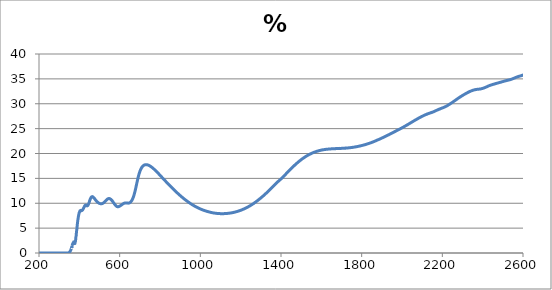
| Category | % Transmission |
|---|---|
| 200.0 | 0 |
| 201.0 | 0 |
| 202.0 | 0 |
| 203.0 | 0 |
| 204.0 | 0 |
| 205.0 | 0 |
| 206.0 | 0 |
| 207.0 | 0 |
| 208.0 | 0 |
| 209.0 | 0 |
| 210.0 | 0 |
| 211.0 | 0 |
| 212.0 | 0 |
| 213.0 | 0 |
| 214.0 | 0 |
| 215.0 | 0 |
| 216.0 | 0 |
| 217.0 | 0 |
| 218.0 | 0 |
| 219.0 | 0 |
| 220.0 | 0 |
| 221.0 | 0 |
| 222.0 | 0 |
| 223.0 | 0 |
| 224.0 | 0 |
| 225.0 | 0 |
| 226.0 | 0 |
| 227.0 | 0 |
| 228.0 | 0 |
| 229.0 | 0 |
| 230.0 | 0 |
| 231.0 | 0 |
| 232.0 | 0 |
| 233.0 | 0 |
| 234.0 | 0 |
| 235.0 | 0 |
| 236.0 | 0 |
| 237.0 | 0 |
| 238.0 | 0 |
| 239.0 | 0 |
| 240.0 | 0 |
| 241.0 | 0 |
| 242.0 | 0 |
| 243.0 | 0 |
| 244.0 | 0 |
| 245.0 | 0 |
| 246.0 | 0 |
| 247.0 | 0 |
| 248.0 | 0 |
| 249.0 | 0 |
| 250.0 | 0 |
| 251.0 | 0 |
| 252.0 | 0 |
| 253.0 | 0 |
| 254.0 | 0 |
| 255.0 | 0 |
| 256.0 | 0 |
| 257.0 | 0 |
| 258.0 | 0 |
| 259.0 | 0 |
| 260.0 | 0 |
| 261.0 | 0 |
| 262.0 | 0 |
| 263.0 | 0 |
| 264.0 | 0 |
| 265.0 | 0 |
| 266.0 | 0 |
| 267.0 | 0 |
| 268.0 | 0 |
| 269.0 | 0 |
| 270.0 | 0 |
| 271.0 | 0 |
| 272.0 | 0 |
| 273.0 | 0 |
| 274.0 | 0 |
| 275.0 | 0 |
| 276.0 | 0 |
| 277.0 | 0 |
| 278.0 | 0 |
| 279.0 | 0 |
| 280.0 | 0 |
| 281.0 | 0 |
| 282.0 | 0 |
| 283.0 | 0 |
| 284.0 | 0 |
| 285.0 | 0 |
| 286.0 | 0 |
| 287.0 | 0 |
| 288.0 | 0 |
| 289.0 | 0 |
| 290.0 | 0 |
| 291.0 | 0 |
| 292.0 | 0 |
| 293.0 | 0 |
| 294.0 | 0 |
| 295.0 | 0 |
| 296.0 | 0 |
| 297.0 | 0 |
| 298.0 | 0 |
| 299.0 | 0 |
| 300.0 | 0 |
| 301.0 | 0 |
| 302.0 | 0 |
| 303.0 | 0 |
| 304.0 | 0 |
| 305.0 | 0 |
| 306.0 | 0 |
| 307.0 | 0 |
| 308.0 | 0 |
| 309.0 | 0 |
| 310.0 | 0 |
| 311.0 | 0 |
| 312.0 | 0 |
| 313.0 | 0 |
| 314.0 | 0 |
| 315.0 | 0 |
| 316.0 | 0 |
| 317.0 | 0 |
| 318.0 | 0 |
| 319.0 | 0 |
| 320.0 | 0 |
| 321.0 | 0 |
| 322.0 | 0 |
| 323.0 | 0 |
| 324.0 | 0 |
| 325.0 | 0 |
| 326.0 | 0 |
| 327.0 | 0 |
| 328.0 | 0 |
| 329.0 | 0 |
| 330.0 | 0 |
| 331.0 | 0 |
| 332.0 | 0 |
| 333.0 | 0 |
| 334.0 | 0 |
| 335.0 | 0 |
| 336.0 | 0.001 |
| 337.0 | 0.001 |
| 338.0 | 0.002 |
| 339.0 | 0.003 |
| 340.0 | 0.004 |
| 341.0 | 0.007 |
| 342.0 | 0.01 |
| 343.0 | 0.015 |
| 344.0 | 0.021 |
| 345.0 | 0.03 |
| 346.0 | 0.041 |
| 347.0 | 0.056 |
| 348.0 | 0.075 |
| 349.0 | 0.099 |
| 350.0 | 0.129 |
| 351.0 | 0.164 |
| 352.0 | 0.207 |
| 353.0 | 0.256 |
| 354.0 | 0.312 |
| 355.0 | 0.378 |
| 356.0 | 0.453 |
| 357.0 | 0.54 |
| 358.0 | 0.637 |
| 359.0 | 0.744 |
| 360.0 | 0.863 |
| 361.0 | 0.99 |
| 362.0 | 1.124 |
| 363.0 | 1.021 |
| 364.0 | 1.442 |
| 365.0 | 1.608 |
| 366.0 | 1.713 |
| 367.0 | 1.829 |
| 368.0 | 1.947 |
| 369.0 | 1.919 |
| 370.0 | 2.068 |
| 371.0 | 2.061 |
| 372.0 | 2.236 |
| 373.0 | 2.046 |
| 374.0 | 1.979 |
| 375.0 | 1.981 |
| 376.0 | 1.899 |
| 377.0 | 1.944 |
| 378.0 | 1.903 |
| 379.0 | 2.208 |
| 380.0 | 2.252 |
| 381.0 | 2.43 |
| 382.0 | 2.763 |
| 383.0 | 3.207 |
| 384.0 | 3.401 |
| 385.0 | 3.907 |
| 386.0 | 4.207 |
| 387.0 | 4.649 |
| 388.0 | 4.839 |
| 389.0 | 5.319 |
| 390.0 | 5.76 |
| 391.0 | 6.071 |
| 392.0 | 6.46 |
| 393.0 | 6.685 |
| 394.0 | 6.941 |
| 395.0 | 7.236 |
| 396.0 | 7.479 |
| 397.0 | 7.658 |
| 398.0 | 7.869 |
| 399.0 | 8.055 |
| 400.0 | 8.169 |
| 401.0 | 8.231 |
| 402.0 | 8.36 |
| 403.0 | 8.473 |
| 404.0 | 8.446 |
| 405.0 | 8.493 |
| 406.0 | 8.51 |
| 407.0 | 8.511 |
| 408.0 | 8.575 |
| 409.0 | 8.514 |
| 410.0 | 8.493 |
| 411.0 | 8.527 |
| 412.0 | 8.532 |
| 413.0 | 8.56 |
| 414.0 | 8.563 |
| 415.0 | 8.607 |
| 416.0 | 8.663 |
| 417.0 | 8.695 |
| 418.0 | 8.795 |
| 419.0 | 8.862 |
| 420.0 | 8.94 |
| 421.0 | 8.974 |
| 422.0 | 9.122 |
| 423.0 | 9.168 |
| 424.0 | 9.24 |
| 425.0 | 9.355 |
| 426.0 | 9.423 |
| 427.0 | 9.462 |
| 428.0 | 9.547 |
| 429.0 | 9.563 |
| 430.0 | 9.605 |
| 431.0 | 9.616 |
| 432.0 | 9.65 |
| 433.0 | 9.632 |
| 434.0 | 9.618 |
| 435.0 | 9.608 |
| 436.0 | 9.558 |
| 437.0 | 9.524 |
| 438.0 | 9.467 |
| 439.0 | 9.492 |
| 440.0 | 9.493 |
| 441.0 | 9.536 |
| 442.0 | 9.536 |
| 443.0 | 9.631 |
| 444.0 | 9.683 |
| 445.0 | 9.778 |
| 446.0 | 9.872 |
| 447.0 | 10.003 |
| 448.0 | 10.08 |
| 449.0 | 10.215 |
| 450.0 | 10.337 |
| 451.0 | 10.48 |
| 452.0 | 10.598 |
| 453.0 | 10.693 |
| 454.0 | 10.813 |
| 455.0 | 10.903 |
| 456.0 | 10.998 |
| 457.0 | 11.06 |
| 458.0 | 11.164 |
| 459.0 | 11.196 |
| 460.0 | 11.253 |
| 461.0 | 11.287 |
| 462.0 | 11.317 |
| 463.0 | 11.327 |
| 464.0 | 11.333 |
| 465.0 | 11.322 |
| 466.0 | 11.311 |
| 467.0 | 11.286 |
| 468.0 | 11.247 |
| 469.0 | 11.219 |
| 470.0 | 11.174 |
| 471.0 | 11.146 |
| 472.0 | 11.09 |
| 473.0 | 11.043 |
| 474.0 | 10.996 |
| 475.0 | 10.955 |
| 476.0 | 10.91 |
| 477.0 | 10.848 |
| 478.0 | 10.794 |
| 479.0 | 10.74 |
| 480.0 | 10.683 |
| 481.0 | 10.625 |
| 482.0 | 10.575 |
| 483.0 | 10.537 |
| 484.0 | 10.473 |
| 485.0 | 10.443 |
| 486.0 | 10.383 |
| 487.0 | 10.35 |
| 488.0 | 10.301 |
| 489.0 | 10.262 |
| 490.0 | 10.24 |
| 491.0 | 10.189 |
| 492.0 | 10.177 |
| 493.0 | 10.137 |
| 494.0 | 10.117 |
| 495.0 | 10.075 |
| 496.0 | 10.049 |
| 497.0 | 10.027 |
| 498.0 | 10.011 |
| 499.0 | 9.984 |
| 500.0 | 9.97 |
| 501.0 | 9.955 |
| 502.0 | 9.939 |
| 503.0 | 9.928 |
| 504.0 | 9.915 |
| 505.0 | 9.906 |
| 506.0 | 9.882 |
| 507.0 | 9.887 |
| 508.0 | 9.895 |
| 509.0 | 9.878 |
| 510.0 | 9.891 |
| 511.0 | 9.909 |
| 512.0 | 9.917 |
| 513.0 | 9.93 |
| 514.0 | 9.941 |
| 515.0 | 9.965 |
| 516.0 | 9.975 |
| 517.0 | 10.011 |
| 518.0 | 10.033 |
| 519.0 | 10.052 |
| 520.0 | 10.082 |
| 521.0 | 10.102 |
| 522.0 | 10.132 |
| 523.0 | 10.175 |
| 524.0 | 10.21 |
| 525.0 | 10.248 |
| 526.0 | 10.285 |
| 527.0 | 10.322 |
| 528.0 | 10.376 |
| 529.0 | 10.419 |
| 530.0 | 10.461 |
| 531.0 | 10.503 |
| 532.0 | 10.555 |
| 533.0 | 10.595 |
| 534.0 | 10.638 |
| 535.0 | 10.673 |
| 536.0 | 10.708 |
| 537.0 | 10.747 |
| 538.0 | 10.79 |
| 539.0 | 10.834 |
| 540.0 | 10.847 |
| 541.0 | 10.877 |
| 542.0 | 10.887 |
| 543.0 | 10.907 |
| 544.0 | 10.92 |
| 545.0 | 10.941 |
| 546.0 | 10.942 |
| 547.0 | 10.942 |
| 548.0 | 10.947 |
| 549.0 | 10.934 |
| 550.0 | 10.93 |
| 551.0 | 10.921 |
| 552.0 | 10.886 |
| 553.0 | 10.873 |
| 554.0 | 10.836 |
| 555.0 | 10.809 |
| 556.0 | 10.783 |
| 557.0 | 10.752 |
| 558.0 | 10.694 |
| 559.0 | 10.659 |
| 560.0 | 10.62 |
| 561.0 | 10.578 |
| 562.0 | 10.524 |
| 563.0 | 10.491 |
| 564.0 | 10.426 |
| 565.0 | 10.362 |
| 566.0 | 10.331 |
| 567.0 | 10.262 |
| 568.0 | 10.196 |
| 569.0 | 10.132 |
| 570.0 | 10.097 |
| 571.0 | 10.038 |
| 572.0 | 9.977 |
| 573.0 | 9.924 |
| 574.0 | 9.872 |
| 575.0 | 9.816 |
| 576.0 | 9.759 |
| 577.0 | 9.709 |
| 578.0 | 9.658 |
| 579.0 | 9.618 |
| 580.0 | 9.568 |
| 581.0 | 9.528 |
| 582.0 | 9.493 |
| 583.0 | 9.45 |
| 584.0 | 9.412 |
| 585.0 | 9.392 |
| 586.0 | 9.36 |
| 587.0 | 9.336 |
| 588.0 | 9.326 |
| 589.0 | 9.305 |
| 590.0 | 9.297 |
| 591.0 | 9.296 |
| 592.0 | 9.299 |
| 593.0 | 9.307 |
| 594.0 | 9.312 |
| 595.0 | 9.324 |
| 596.0 | 9.344 |
| 597.0 | 9.355 |
| 598.0 | 9.38 |
| 599.0 | 9.403 |
| 600.0 | 9.416 |
| 601.0 | 9.445 |
| 602.0 | 9.473 |
| 603.0 | 9.492 |
| 604.0 | 9.523 |
| 605.0 | 9.55 |
| 606.0 | 9.573 |
| 607.0 | 9.603 |
| 608.0 | 9.631 |
| 609.0 | 9.661 |
| 610.0 | 9.689 |
| 611.0 | 9.721 |
| 612.0 | 9.751 |
| 613.0 | 9.78 |
| 614.0 | 9.806 |
| 615.0 | 9.839 |
| 616.0 | 9.865 |
| 617.0 | 9.889 |
| 618.0 | 9.918 |
| 619.0 | 9.943 |
| 620.0 | 9.961 |
| 621.0 | 9.98 |
| 622.0 | 10.004 |
| 623.0 | 10.016 |
| 624.0 | 10.029 |
| 625.0 | 10.042 |
| 626.0 | 10.05 |
| 627.0 | 10.057 |
| 628.0 | 10.063 |
| 629.0 | 10.064 |
| 630.0 | 10.06 |
| 631.0 | 10.066 |
| 632.0 | 10.057 |
| 633.0 | 10.055 |
| 634.0 | 10.051 |
| 635.0 | 10.04 |
| 636.0 | 10.043 |
| 637.0 | 10.042 |
| 638.0 | 10.032 |
| 639.0 | 10.025 |
| 640.0 | 10.027 |
| 641.0 | 10.021 |
| 642.0 | 10.024 |
| 643.0 | 10.021 |
| 644.0 | 10.028 |
| 645.0 | 10.034 |
| 646.0 | 10.037 |
| 647.0 | 10.053 |
| 648.0 | 10.064 |
| 649.0 | 10.087 |
| 650.0 | 10.113 |
| 651.0 | 10.136 |
| 652.0 | 10.167 |
| 653.0 | 10.197 |
| 654.0 | 10.231 |
| 655.0 | 10.276 |
| 656.0 | 10.318 |
| 657.0 | 10.37 |
| 658.0 | 10.423 |
| 659.0 | 10.484 |
| 660.0 | 10.55 |
| 661.0 | 10.618 |
| 662.0 | 10.692 |
| 663.0 | 10.775 |
| 664.0 | 10.859 |
| 665.0 | 10.951 |
| 666.0 | 11.05 |
| 667.0 | 11.155 |
| 668.0 | 11.265 |
| 669.0 | 11.379 |
| 670.0 | 11.505 |
| 671.0 | 11.639 |
| 672.0 | 11.771 |
| 673.0 | 11.915 |
| 674.0 | 12.069 |
| 675.0 | 12.23 |
| 676.0 | 12.388 |
| 677.0 | 12.554 |
| 678.0 | 12.731 |
| 679.0 | 12.911 |
| 680.0 | 13.083 |
| 681.0 | 13.272 |
| 682.0 | 13.456 |
| 683.0 | 13.645 |
| 684.0 | 13.836 |
| 685.0 | 14.02 |
| 686.0 | 14.208 |
| 687.0 | 14.387 |
| 688.0 | 14.568 |
| 689.0 | 14.749 |
| 690.0 | 14.923 |
| 691.0 | 15.089 |
| 692.0 | 15.259 |
| 693.0 | 15.415 |
| 694.0 | 15.569 |
| 695.0 | 15.715 |
| 696.0 | 15.859 |
| 697.0 | 15.995 |
| 698.0 | 16.119 |
| 699.0 | 16.246 |
| 700.0 | 16.367 |
| 701.0 | 16.472 |
| 702.0 | 16.578 |
| 703.0 | 16.676 |
| 704.0 | 16.768 |
| 705.0 | 16.862 |
| 706.0 | 16.941 |
| 707.0 | 17.02 |
| 708.0 | 17.088 |
| 709.0 | 17.156 |
| 710.0 | 17.212 |
| 711.0 | 17.281 |
| 712.0 | 17.33 |
| 713.0 | 17.383 |
| 714.0 | 17.435 |
| 715.0 | 17.463 |
| 716.0 | 17.515 |
| 717.0 | 17.547 |
| 718.0 | 17.581 |
| 719.0 | 17.6 |
| 720.0 | 17.631 |
| 721.0 | 17.663 |
| 722.0 | 17.677 |
| 723.0 | 17.694 |
| 724.0 | 17.708 |
| 725.0 | 17.717 |
| 726.0 | 17.732 |
| 727.0 | 17.738 |
| 728.0 | 17.748 |
| 729.0 | 17.75 |
| 730.0 | 17.749 |
| 731.0 | 17.753 |
| 732.0 | 17.754 |
| 733.0 | 17.743 |
| 734.0 | 17.743 |
| 735.0 | 17.737 |
| 736.0 | 17.73 |
| 737.0 | 17.725 |
| 738.0 | 17.721 |
| 739.0 | 17.706 |
| 740.0 | 17.691 |
| 741.0 | 17.676 |
| 742.0 | 17.658 |
| 743.0 | 17.643 |
| 744.0 | 17.622 |
| 745.0 | 17.601 |
| 746.0 | 17.583 |
| 747.0 | 17.562 |
| 748.0 | 17.545 |
| 749.0 | 17.513 |
| 750.0 | 17.489 |
| 751.0 | 17.469 |
| 752.0 | 17.44 |
| 753.0 | 17.421 |
| 754.0 | 17.393 |
| 755.0 | 17.364 |
| 756.0 | 17.332 |
| 757.0 | 17.301 |
| 758.0 | 17.278 |
| 759.0 | 17.239 |
| 760.0 | 17.217 |
| 761.0 | 17.179 |
| 762.0 | 17.15 |
| 763.0 | 17.113 |
| 764.0 | 17.08 |
| 765.0 | 17.05 |
| 766.0 | 17.011 |
| 767.0 | 16.976 |
| 768.0 | 16.933 |
| 769.0 | 16.905 |
| 770.0 | 16.869 |
| 771.0 | 16.828 |
| 772.0 | 16.795 |
| 773.0 | 16.755 |
| 774.0 | 16.714 |
| 775.0 | 16.677 |
| 776.0 | 16.64 |
| 777.0 | 16.604 |
| 778.0 | 16.563 |
| 779.0 | 16.524 |
| 780.0 | 16.474 |
| 781.0 | 16.444 |
| 782.0 | 16.395 |
| 783.0 | 16.361 |
| 784.0 | 16.321 |
| 785.0 | 16.278 |
| 786.0 | 16.232 |
| 787.0 | 16.191 |
| 788.0 | 16.152 |
| 789.0 | 16.11 |
| 790.0 | 16.072 |
| 791.0 | 16.026 |
| 792.0 | 15.987 |
| 793.0 | 15.942 |
| 794.0 | 15.904 |
| 795.0 | 15.853 |
| 796.0 | 15.812 |
| 797.0 | 15.762 |
| 798.0 | 15.72 |
| 799.0 | 15.681 |
| 800.0 | 15.641 |
| 801.0 | 15.59 |
| 802.0 | 15.552 |
| 803.0 | 15.509 |
| 804.0 | 15.467 |
| 805.0 | 15.421 |
| 806.0 | 15.378 |
| 807.0 | 15.333 |
| 808.0 | 15.29 |
| 809.0 | 15.246 |
| 810.0 | 15.198 |
| 811.0 | 15.156 |
| 812.0 | 15.112 |
| 813.0 | 15.072 |
| 814.0 | 15.027 |
| 815.0 | 14.979 |
| 816.0 | 14.938 |
| 817.0 | 14.897 |
| 818.0 | 14.852 |
| 819.0 | 14.813 |
| 820.0 | 14.765 |
| 821.0 | 14.713 |
| 822.0 | 14.675 |
| 823.0 | 14.638 |
| 824.0 | 14.59 |
| 825.0 | 14.55 |
| 826.0 | 14.505 |
| 827.0 | 14.467 |
| 828.0 | 14.419 |
| 829.0 | 14.376 |
| 830.0 | 14.333 |
| 831.0 | 14.295 |
| 832.0 | 14.241 |
| 833.0 | 14.202 |
| 834.0 | 14.158 |
| 835.0 | 14.118 |
| 836.0 | 14.077 |
| 837.0 | 14.031 |
| 838.0 | 13.992 |
| 839.0 | 13.945 |
| 840.0 | 13.908 |
| 841.0 | 13.869 |
| 842.0 | 13.828 |
| 843.0 | 13.78 |
| 844.0 | 13.737 |
| 845.0 | 13.695 |
| 846.0 | 13.654 |
| 847.0 | 13.612 |
| 848.0 | 13.574 |
| 849.0 | 13.533 |
| 850.0 | 13.488 |
| 851.0 | 13.449 |
| 852.0 | 13.409 |
| 853.0 | 13.366 |
| 854.0 | 13.322 |
| 855.0 | 13.283 |
| 856.0 | 13.239 |
| 857.0 | 13.198 |
| 858.0 | 13.158 |
| 859.0 | 13.12 |
| 860.0 | 13.079 |
| 861.0 | 13.036 |
| 862.0 | 12.997 |
| 863.0 | 12.954 |
| 864.0 | 12.915 |
| 865.0 | 12.876 |
| 866.0 | 12.835 |
| 867.0 | 12.794 |
| 868.0 | 12.758 |
| 869.0 | 12.716 |
| 870.0 | 12.68 |
| 871.0 | 12.639 |
| 872.0 | 12.599 |
| 873.0 | 12.56 |
| 874.0 | 12.521 |
| 875.0 | 12.483 |
| 876.0 | 12.442 |
| 877.0 | 12.405 |
| 878.0 | 12.366 |
| 879.0 | 12.328 |
| 880.0 | 12.287 |
| 881.0 | 12.252 |
| 882.0 | 12.213 |
| 883.0 | 12.175 |
| 884.0 | 12.138 |
| 885.0 | 12.102 |
| 886.0 | 12.063 |
| 887.0 | 12.024 |
| 888.0 | 11.988 |
| 889.0 | 11.948 |
| 890.0 | 11.912 |
| 891.0 | 11.876 |
| 892.0 | 11.84 |
| 893.0 | 11.803 |
| 894.0 | 11.765 |
| 895.0 | 11.728 |
| 896.0 | 11.694 |
| 897.0 | 11.657 |
| 898.0 | 11.621 |
| 899.0 | 11.585 |
| 900.0 | 11.55 |
| 901.0 | 11.513 |
| 902.0 | 11.478 |
| 903.0 | 11.444 |
| 904.0 | 11.409 |
| 905.0 | 11.375 |
| 906.0 | 11.34 |
| 907.0 | 11.306 |
| 908.0 | 11.269 |
| 909.0 | 11.234 |
| 910.0 | 11.2 |
| 911.0 | 11.168 |
| 912.0 | 11.134 |
| 913.0 | 11.1 |
| 914.0 | 11.067 |
| 915.0 | 11.032 |
| 916.0 | 10.999 |
| 917.0 | 10.966 |
| 918.0 | 10.934 |
| 919.0 | 10.902 |
| 920.0 | 10.866 |
| 921.0 | 10.836 |
| 922.0 | 10.803 |
| 923.0 | 10.772 |
| 924.0 | 10.739 |
| 925.0 | 10.71 |
| 926.0 | 10.678 |
| 927.0 | 10.645 |
| 928.0 | 10.614 |
| 929.0 | 10.584 |
| 930.0 | 10.555 |
| 931.0 | 10.523 |
| 932.0 | 10.493 |
| 933.0 | 10.463 |
| 934.0 | 10.432 |
| 935.0 | 10.403 |
| 936.0 | 10.372 |
| 937.0 | 10.344 |
| 938.0 | 10.314 |
| 939.0 | 10.286 |
| 940.0 | 10.257 |
| 941.0 | 10.228 |
| 942.0 | 10.2 |
| 943.0 | 10.171 |
| 944.0 | 10.142 |
| 945.0 | 10.113 |
| 946.0 | 10.085 |
| 947.0 | 10.057 |
| 948.0 | 10.03 |
| 949.0 | 10.002 |
| 950.0 | 9.976 |
| 951.0 | 9.948 |
| 952.0 | 9.919 |
| 953.0 | 9.893 |
| 954.0 | 9.868 |
| 955.0 | 9.84 |
| 956.0 | 9.813 |
| 957.0 | 9.789 |
| 958.0 | 9.763 |
| 959.0 | 9.737 |
| 960.0 | 9.712 |
| 961.0 | 9.687 |
| 962.0 | 9.661 |
| 963.0 | 9.637 |
| 964.0 | 9.613 |
| 965.0 | 9.588 |
| 966.0 | 9.564 |
| 967.0 | 9.541 |
| 968.0 | 9.517 |
| 969.0 | 9.493 |
| 970.0 | 9.47 |
| 971.0 | 9.447 |
| 972.0 | 9.424 |
| 973.0 | 9.402 |
| 974.0 | 9.378 |
| 975.0 | 9.357 |
| 976.0 | 9.335 |
| 977.0 | 9.312 |
| 978.0 | 9.29 |
| 979.0 | 9.269 |
| 980.0 | 9.248 |
| 981.0 | 9.226 |
| 982.0 | 9.205 |
| 983.0 | 9.184 |
| 984.0 | 9.163 |
| 985.0 | 9.143 |
| 986.0 | 9.122 |
| 987.0 | 9.103 |
| 988.0 | 9.082 |
| 989.0 | 9.062 |
| 990.0 | 9.043 |
| 991.0 | 9.023 |
| 992.0 | 9.004 |
| 993.0 | 8.985 |
| 994.0 | 8.966 |
| 995.0 | 8.947 |
| 996.0 | 8.929 |
| 997.0 | 8.911 |
| 998.0 | 8.893 |
| 999.0 | 8.875 |
| 1000.0 | 8.857 |
| 1001.0 | 8.841 |
| 1002.0 | 8.821 |
| 1003.0 | 8.805 |
| 1004.0 | 8.788 |
| 1005.0 | 8.771 |
| 1006.0 | 8.753 |
| 1007.0 | 8.738 |
| 1008.0 | 8.721 |
| 1009.0 | 8.705 |
| 1010.0 | 8.689 |
| 1011.0 | 8.675 |
| 1012.0 | 8.657 |
| 1013.0 | 8.641 |
| 1014.0 | 8.628 |
| 1015.0 | 8.613 |
| 1016.0 | 8.597 |
| 1017.0 | 8.583 |
| 1018.0 | 8.568 |
| 1019.0 | 8.553 |
| 1020.0 | 8.54 |
| 1021.0 | 8.525 |
| 1022.0 | 8.51 |
| 1023.0 | 8.498 |
| 1024.0 | 8.483 |
| 1025.0 | 8.47 |
| 1026.0 | 8.457 |
| 1027.0 | 8.444 |
| 1028.0 | 8.431 |
| 1029.0 | 8.418 |
| 1030.0 | 8.407 |
| 1031.0 | 8.393 |
| 1032.0 | 8.382 |
| 1033.0 | 8.37 |
| 1034.0 | 8.357 |
| 1035.0 | 8.346 |
| 1036.0 | 8.334 |
| 1037.0 | 8.323 |
| 1038.0 | 8.312 |
| 1039.0 | 8.302 |
| 1040.0 | 8.29 |
| 1041.0 | 8.279 |
| 1042.0 | 8.269 |
| 1043.0 | 8.258 |
| 1044.0 | 8.249 |
| 1045.0 | 8.238 |
| 1046.0 | 8.228 |
| 1047.0 | 8.218 |
| 1048.0 | 8.21 |
| 1049.0 | 8.199 |
| 1050.0 | 8.176 |
| 1051.0 | 8.164 |
| 1052.0 | 8.156 |
| 1053.0 | 8.147 |
| 1054.0 | 8.137 |
| 1055.0 | 8.13 |
| 1056.0 | 8.12 |
| 1057.0 | 8.115 |
| 1058.0 | 8.108 |
| 1059.0 | 8.099 |
| 1060.0 | 8.09 |
| 1061.0 | 8.084 |
| 1062.0 | 8.076 |
| 1063.0 | 8.068 |
| 1064.0 | 8.063 |
| 1065.0 | 8.056 |
| 1066.0 | 8.049 |
| 1067.0 | 8.039 |
| 1068.0 | 8.036 |
| 1069.0 | 8.029 |
| 1070.0 | 8.022 |
| 1071.0 | 8.017 |
| 1072.0 | 8.012 |
| 1073.0 | 8.007 |
| 1074.0 | 7.998 |
| 1075.0 | 7.994 |
| 1076.0 | 7.992 |
| 1077.0 | 7.982 |
| 1078.0 | 7.98 |
| 1079.0 | 7.975 |
| 1080.0 | 7.971 |
| 1081.0 | 7.965 |
| 1082.0 | 7.96 |
| 1083.0 | 7.957 |
| 1084.0 | 7.953 |
| 1085.0 | 7.948 |
| 1086.0 | 7.946 |
| 1087.0 | 7.943 |
| 1088.0 | 7.939 |
| 1089.0 | 7.936 |
| 1090.0 | 7.934 |
| 1091.0 | 7.93 |
| 1092.0 | 7.926 |
| 1093.0 | 7.927 |
| 1094.0 | 7.925 |
| 1095.0 | 7.919 |
| 1096.0 | 7.918 |
| 1097.0 | 7.918 |
| 1098.0 | 7.913 |
| 1099.0 | 7.912 |
| 1100.0 | 7.912 |
| 1101.0 | 7.912 |
| 1102.0 | 7.912 |
| 1103.0 | 7.908 |
| 1104.0 | 7.907 |
| 1105.0 | 7.906 |
| 1106.0 | 7.906 |
| 1107.0 | 7.907 |
| 1108.0 | 7.906 |
| 1109.0 | 7.907 |
| 1110.0 | 7.905 |
| 1111.0 | 7.905 |
| 1112.0 | 7.906 |
| 1113.0 | 7.906 |
| 1114.0 | 7.909 |
| 1115.0 | 7.911 |
| 1116.0 | 7.911 |
| 1117.0 | 7.909 |
| 1118.0 | 7.913 |
| 1119.0 | 7.919 |
| 1120.0 | 7.914 |
| 1121.0 | 7.919 |
| 1122.0 | 7.921 |
| 1123.0 | 7.921 |
| 1124.0 | 7.923 |
| 1125.0 | 7.926 |
| 1126.0 | 7.928 |
| 1127.0 | 7.932 |
| 1128.0 | 7.936 |
| 1129.0 | 7.939 |
| 1130.0 | 7.941 |
| 1131.0 | 7.942 |
| 1132.0 | 7.949 |
| 1133.0 | 7.951 |
| 1134.0 | 7.956 |
| 1135.0 | 7.96 |
| 1136.0 | 7.966 |
| 1137.0 | 7.975 |
| 1138.0 | 7.966 |
| 1139.0 | 7.981 |
| 1140.0 | 7.982 |
| 1141.0 | 7.988 |
| 1142.0 | 7.997 |
| 1143.0 | 7.997 |
| 1144.0 | 8.004 |
| 1145.0 | 8.01 |
| 1146.0 | 8.018 |
| 1147.0 | 8.021 |
| 1148.0 | 8.028 |
| 1149.0 | 8.037 |
| 1150.0 | 8.036 |
| 1151.0 | 8.048 |
| 1152.0 | 8.054 |
| 1153.0 | 8.061 |
| 1154.0 | 8.067 |
| 1155.0 | 8.079 |
| 1156.0 | 8.083 |
| 1157.0 | 8.093 |
| 1158.0 | 8.095 |
| 1159.0 | 8.106 |
| 1160.0 | 8.116 |
| 1161.0 | 8.122 |
| 1162.0 | 8.131 |
| 1163.0 | 8.142 |
| 1164.0 | 8.146 |
| 1165.0 | 8.156 |
| 1166.0 | 8.169 |
| 1167.0 | 8.175 |
| 1168.0 | 8.193 |
| 1169.0 | 8.19 |
| 1170.0 | 8.205 |
| 1171.0 | 8.215 |
| 1172.0 | 8.226 |
| 1173.0 | 8.238 |
| 1174.0 | 8.245 |
| 1175.0 | 8.259 |
| 1176.0 | 8.27 |
| 1177.0 | 8.279 |
| 1178.0 | 8.29 |
| 1179.0 | 8.304 |
| 1180.0 | 8.314 |
| 1181.0 | 8.327 |
| 1182.0 | 8.334 |
| 1183.0 | 8.349 |
| 1184.0 | 8.363 |
| 1185.0 | 8.375 |
| 1186.0 | 8.391 |
| 1187.0 | 8.398 |
| 1188.0 | 8.416 |
| 1189.0 | 8.428 |
| 1190.0 | 8.44 |
| 1191.0 | 8.453 |
| 1192.0 | 8.467 |
| 1193.0 | 8.482 |
| 1194.0 | 8.493 |
| 1195.0 | 8.51 |
| 1196.0 | 8.522 |
| 1197.0 | 8.539 |
| 1198.0 | 8.555 |
| 1199.0 | 8.569 |
| 1200.0 | 8.586 |
| 1201.0 | 8.601 |
| 1202.0 | 8.612 |
| 1203.0 | 8.629 |
| 1204.0 | 8.646 |
| 1205.0 | 8.662 |
| 1206.0 | 8.678 |
| 1207.0 | 8.694 |
| 1208.0 | 8.711 |
| 1209.0 | 8.727 |
| 1210.0 | 8.745 |
| 1211.0 | 8.774 |
| 1212.0 | 8.78 |
| 1213.0 | 8.797 |
| 1214.0 | 8.813 |
| 1215.0 | 8.835 |
| 1216.0 | 8.852 |
| 1217.0 | 8.867 |
| 1218.0 | 8.888 |
| 1219.0 | 8.908 |
| 1220.0 | 8.926 |
| 1221.0 | 8.939 |
| 1222.0 | 8.967 |
| 1223.0 | 8.985 |
| 1224.0 | 9.002 |
| 1225.0 | 9.02 |
| 1226.0 | 9.043 |
| 1227.0 | 9.068 |
| 1228.0 | 9.087 |
| 1229.0 | 9.104 |
| 1230.0 | 9.12 |
| 1231.0 | 9.149 |
| 1232.0 | 9.169 |
| 1233.0 | 9.191 |
| 1234.0 | 9.207 |
| 1235.0 | 9.23 |
| 1236.0 | 9.261 |
| 1237.0 | 9.278 |
| 1238.0 | 9.298 |
| 1239.0 | 9.32 |
| 1240.0 | 9.347 |
| 1241.0 | 9.368 |
| 1242.0 | 9.391 |
| 1243.0 | 9.417 |
| 1244.0 | 9.44 |
| 1245.0 | 9.464 |
| 1246.0 | 9.487 |
| 1247.0 | 9.511 |
| 1248.0 | 9.537 |
| 1249.0 | 9.562 |
| 1250.0 | 9.587 |
| 1251.0 | 9.589 |
| 1252.0 | 9.634 |
| 1253.0 | 9.659 |
| 1254.0 | 9.688 |
| 1255.0 | 9.713 |
| 1256.0 | 9.736 |
| 1257.0 | 9.764 |
| 1258.0 | 9.798 |
| 1259.0 | 9.82 |
| 1260.0 | 9.843 |
| 1261.0 | 9.875 |
| 1262.0 | 9.902 |
| 1263.0 | 9.927 |
| 1264.0 | 9.953 |
| 1265.0 | 9.983 |
| 1266.0 | 9.985 |
| 1267.0 | 10.038 |
| 1268.0 | 10.065 |
| 1269.0 | 10.096 |
| 1270.0 | 10.124 |
| 1271.0 | 10.151 |
| 1272.0 | 10.181 |
| 1273.0 | 10.21 |
| 1274.0 | 10.238 |
| 1275.0 | 10.268 |
| 1276.0 | 10.299 |
| 1277.0 | 10.328 |
| 1278.0 | 10.357 |
| 1279.0 | 10.389 |
| 1280.0 | 10.419 |
| 1281.0 | 10.451 |
| 1282.0 | 10.481 |
| 1283.0 | 10.514 |
| 1284.0 | 10.543 |
| 1285.0 | 10.571 |
| 1286.0 | 10.607 |
| 1287.0 | 10.64 |
| 1288.0 | 10.671 |
| 1289.0 | 10.702 |
| 1290.0 | 10.734 |
| 1291.0 | 10.767 |
| 1292.0 | 10.799 |
| 1293.0 | 10.831 |
| 1294.0 | 10.866 |
| 1295.0 | 10.898 |
| 1296.0 | 10.928 |
| 1297.0 | 10.967 |
| 1298.0 | 10.996 |
| 1299.0 | 11.031 |
| 1300.0 | 11.065 |
| 1301.0 | 11.099 |
| 1302.0 | 11.134 |
| 1303.0 | 11.167 |
| 1304.0 | 11.203 |
| 1305.0 | 11.235 |
| 1306.0 | 11.275 |
| 1307.0 | 11.302 |
| 1308.0 | 11.342 |
| 1309.0 | 11.376 |
| 1310.0 | 11.413 |
| 1311.0 | 11.453 |
| 1312.0 | 11.485 |
| 1313.0 | 11.517 |
| 1314.0 | 11.555 |
| 1315.0 | 11.597 |
| 1316.0 | 11.62 |
| 1317.0 | 11.664 |
| 1318.0 | 11.7 |
| 1319.0 | 11.738 |
| 1320.0 | 11.775 |
| 1321.0 | 11.811 |
| 1322.0 | 11.847 |
| 1323.0 | 11.884 |
| 1324.0 | 11.92 |
| 1325.0 | 11.961 |
| 1326.0 | 11.997 |
| 1327.0 | 12.033 |
| 1328.0 | 12.071 |
| 1329.0 | 12.107 |
| 1330.0 | 12.147 |
| 1331.0 | 12.187 |
| 1332.0 | 12.222 |
| 1333.0 | 12.262 |
| 1334.0 | 12.302 |
| 1335.0 | 12.341 |
| 1336.0 | 12.375 |
| 1337.0 | 12.418 |
| 1338.0 | 12.458 |
| 1339.0 | 12.493 |
| 1340.0 | 12.528 |
| 1341.0 | 12.574 |
| 1342.0 | 12.618 |
| 1343.0 | 12.652 |
| 1344.0 | 12.696 |
| 1345.0 | 12.729 |
| 1346.0 | 12.765 |
| 1347.0 | 12.809 |
| 1348.0 | 12.848 |
| 1349.0 | 12.887 |
| 1350.0 | 12.929 |
| 1351.0 | 12.967 |
| 1352.0 | 13.007 |
| 1353.0 | 13.049 |
| 1354.0 | 13.09 |
| 1355.0 | 13.129 |
| 1356.0 | 13.17 |
| 1357.0 | 13.21 |
| 1358.0 | 13.251 |
| 1359.0 | 13.293 |
| 1360.0 | 13.335 |
| 1361.0 | 13.373 |
| 1362.0 | 13.418 |
| 1363.0 | 13.462 |
| 1364.0 | 13.506 |
| 1365.0 | 13.547 |
| 1366.0 | 13.593 |
| 1367.0 | 13.628 |
| 1368.0 | 13.668 |
| 1369.0 | 13.713 |
| 1370.0 | 13.753 |
| 1371.0 | 13.79 |
| 1372.0 | 13.833 |
| 1373.0 | 13.871 |
| 1374.0 | 13.912 |
| 1375.0 | 13.953 |
| 1376.0 | 13.987 |
| 1377.0 | 14.026 |
| 1378.0 | 14.062 |
| 1379.0 | 14.104 |
| 1380.0 | 14.146 |
| 1381.0 | 14.183 |
| 1382.0 | 14.228 |
| 1383.0 | 14.267 |
| 1384.0 | 14.304 |
| 1385.0 | 14.345 |
| 1386.0 | 14.384 |
| 1387.0 | 14.416 |
| 1388.0 | 14.459 |
| 1389.0 | 14.492 |
| 1390.0 | 14.53 |
| 1391.0 | 14.564 |
| 1392.0 | 14.599 |
| 1393.0 | 14.636 |
| 1394.0 | 14.673 |
| 1395.0 | 14.709 |
| 1396.0 | 14.75 |
| 1397.0 | 14.787 |
| 1398.0 | 14.816 |
| 1399.0 | 14.852 |
| 1400.0 | 14.887 |
| 1401.0 | 14.927 |
| 1402.0 | 14.963 |
| 1403.0 | 15.002 |
| 1404.0 | 15.046 |
| 1405.0 | 15.064 |
| 1406.0 | 15.12 |
| 1407.0 | 15.151 |
| 1408.0 | 15.199 |
| 1409.0 | 15.232 |
| 1410.0 | 15.28 |
| 1411.0 | 15.319 |
| 1412.0 | 15.363 |
| 1413.0 | 15.402 |
| 1414.0 | 15.442 |
| 1415.0 | 15.482 |
| 1416.0 | 15.526 |
| 1417.0 | 15.571 |
| 1418.0 | 15.615 |
| 1419.0 | 15.658 |
| 1420.0 | 15.7 |
| 1421.0 | 15.732 |
| 1422.0 | 15.785 |
| 1423.0 | 15.828 |
| 1424.0 | 15.867 |
| 1425.0 | 15.912 |
| 1426.0 | 15.956 |
| 1427.0 | 15.996 |
| 1428.0 | 16.042 |
| 1429.0 | 16.084 |
| 1430.0 | 16.127 |
| 1431.0 | 16.17 |
| 1432.0 | 16.215 |
| 1433.0 | 16.259 |
| 1434.0 | 16.299 |
| 1435.0 | 16.342 |
| 1436.0 | 16.383 |
| 1437.0 | 16.425 |
| 1438.0 | 16.47 |
| 1439.0 | 16.51 |
| 1440.0 | 16.551 |
| 1441.0 | 16.593 |
| 1442.0 | 16.636 |
| 1443.0 | 16.676 |
| 1444.0 | 16.72 |
| 1445.0 | 16.759 |
| 1446.0 | 16.799 |
| 1447.0 | 16.841 |
| 1448.0 | 16.882 |
| 1449.0 | 16.921 |
| 1450.0 | 16.962 |
| 1451.0 | 17.001 |
| 1452.0 | 17.04 |
| 1453.0 | 17.082 |
| 1454.0 | 17.121 |
| 1455.0 | 17.162 |
| 1456.0 | 17.199 |
| 1457.0 | 17.236 |
| 1458.0 | 17.275 |
| 1459.0 | 17.313 |
| 1460.0 | 17.354 |
| 1461.0 | 17.393 |
| 1462.0 | 17.431 |
| 1463.0 | 17.469 |
| 1464.0 | 17.507 |
| 1465.0 | 17.546 |
| 1466.0 | 17.597 |
| 1467.0 | 17.621 |
| 1468.0 | 17.612 |
| 1469.0 | 17.693 |
| 1470.0 | 17.736 |
| 1471.0 | 17.775 |
| 1472.0 | 17.806 |
| 1473.0 | 17.842 |
| 1474.0 | 17.876 |
| 1475.0 | 17.912 |
| 1476.0 | 17.951 |
| 1477.0 | 17.983 |
| 1478.0 | 18.018 |
| 1479.0 | 18.054 |
| 1480.0 | 18.091 |
| 1481.0 | 18.125 |
| 1482.0 | 18.16 |
| 1483.0 | 18.197 |
| 1484.0 | 18.237 |
| 1485.0 | 18.262 |
| 1486.0 | 18.295 |
| 1487.0 | 18.33 |
| 1488.0 | 18.364 |
| 1489.0 | 18.399 |
| 1490.0 | 18.432 |
| 1491.0 | 18.467 |
| 1492.0 | 18.487 |
| 1493.0 | 18.528 |
| 1494.0 | 18.562 |
| 1495.0 | 18.595 |
| 1496.0 | 18.627 |
| 1497.0 | 18.65 |
| 1498.0 | 18.688 |
| 1499.0 | 18.723 |
| 1500.0 | 18.749 |
| 1501.0 | 18.781 |
| 1502.0 | 18.808 |
| 1503.0 | 18.84 |
| 1504.0 | 18.878 |
| 1505.0 | 18.901 |
| 1506.0 | 18.931 |
| 1507.0 | 18.952 |
| 1508.0 | 18.989 |
| 1509.0 | 19.02 |
| 1510.0 | 19.044 |
| 1511.0 | 19.075 |
| 1512.0 | 19.118 |
| 1513.0 | 19.122 |
| 1514.0 | 19.16 |
| 1515.0 | 19.189 |
| 1516.0 | 19.216 |
| 1517.0 | 19.24 |
| 1518.0 | 19.266 |
| 1519.0 | 19.295 |
| 1520.0 | 19.325 |
| 1521.0 | 19.354 |
| 1522.0 | 19.359 |
| 1523.0 | 19.398 |
| 1524.0 | 19.431 |
| 1525.0 | 19.452 |
| 1526.0 | 19.466 |
| 1527.0 | 19.5 |
| 1528.0 | 19.528 |
| 1529.0 | 19.549 |
| 1530.0 | 19.572 |
| 1531.0 | 19.586 |
| 1532.0 | 19.622 |
| 1533.0 | 19.646 |
| 1534.0 | 19.664 |
| 1535.0 | 19.679 |
| 1536.0 | 19.718 |
| 1537.0 | 19.734 |
| 1538.0 | 19.744 |
| 1539.0 | 19.784 |
| 1540.0 | 19.801 |
| 1541.0 | 19.819 |
| 1542.0 | 19.841 |
| 1543.0 | 19.852 |
| 1544.0 | 19.89 |
| 1545.0 | 19.901 |
| 1546.0 | 19.923 |
| 1547.0 | 19.929 |
| 1548.0 | 19.972 |
| 1549.0 | 19.982 |
| 1550.0 | 19.996 |
| 1551.0 | 20.015 |
| 1552.0 | 20.039 |
| 1553.0 | 20.06 |
| 1554.0 | 20.076 |
| 1555.0 | 20.094 |
| 1556.0 | 20.111 |
| 1557.0 | 20.138 |
| 1558.0 | 20.148 |
| 1559.0 | 20.164 |
| 1560.0 | 20.173 |
| 1561.0 | 20.2 |
| 1562.0 | 20.213 |
| 1563.0 | 20.227 |
| 1564.0 | 20.243 |
| 1565.0 | 20.259 |
| 1566.0 | 20.277 |
| 1567.0 | 20.288 |
| 1568.0 | 20.304 |
| 1569.0 | 20.322 |
| 1570.0 | 20.336 |
| 1571.0 | 20.349 |
| 1572.0 | 20.365 |
| 1573.0 | 20.378 |
| 1574.0 | 20.388 |
| 1575.0 | 20.403 |
| 1576.0 | 20.418 |
| 1577.0 | 20.434 |
| 1578.0 | 20.445 |
| 1579.0 | 20.457 |
| 1580.0 | 20.469 |
| 1581.0 | 20.48 |
| 1582.0 | 20.493 |
| 1583.0 | 20.506 |
| 1584.0 | 20.505 |
| 1585.0 | 20.54 |
| 1586.0 | 20.539 |
| 1587.0 | 20.551 |
| 1588.0 | 20.556 |
| 1589.0 | 20.574 |
| 1590.0 | 20.58 |
| 1591.0 | 20.59 |
| 1592.0 | 20.608 |
| 1593.0 | 20.614 |
| 1594.0 | 20.612 |
| 1595.0 | 20.637 |
| 1596.0 | 20.645 |
| 1597.0 | 20.651 |
| 1598.0 | 20.65 |
| 1599.0 | 20.668 |
| 1600.0 | 20.684 |
| 1601.0 | 20.678 |
| 1602.0 | 20.692 |
| 1603.0 | 20.699 |
| 1604.0 | 20.717 |
| 1605.0 | 20.717 |
| 1606.0 | 20.727 |
| 1607.0 | 20.739 |
| 1608.0 | 20.731 |
| 1609.0 | 20.747 |
| 1610.0 | 20.754 |
| 1611.0 | 20.763 |
| 1612.0 | 20.774 |
| 1613.0 | 20.776 |
| 1614.0 | 20.781 |
| 1615.0 | 20.787 |
| 1616.0 | 20.795 |
| 1617.0 | 20.8 |
| 1618.0 | 20.808 |
| 1619.0 | 20.807 |
| 1620.0 | 20.815 |
| 1621.0 | 20.822 |
| 1622.0 | 20.829 |
| 1623.0 | 20.837 |
| 1624.0 | 20.835 |
| 1625.0 | 20.842 |
| 1626.0 | 20.851 |
| 1627.0 | 20.851 |
| 1628.0 | 20.855 |
| 1629.0 | 20.865 |
| 1630.0 | 20.862 |
| 1631.0 | 20.866 |
| 1632.0 | 20.875 |
| 1633.0 | 20.873 |
| 1634.0 | 20.882 |
| 1635.0 | 20.887 |
| 1636.0 | 20.885 |
| 1637.0 | 20.893 |
| 1638.0 | 20.899 |
| 1639.0 | 20.895 |
| 1640.0 | 20.902 |
| 1641.0 | 20.91 |
| 1642.0 | 20.902 |
| 1643.0 | 20.914 |
| 1644.0 | 20.917 |
| 1645.0 | 20.914 |
| 1646.0 | 20.923 |
| 1647.0 | 20.922 |
| 1648.0 | 20.924 |
| 1649.0 | 20.934 |
| 1650.0 | 20.932 |
| 1651.0 | 20.932 |
| 1652.0 | 20.943 |
| 1653.0 | 20.936 |
| 1654.0 | 20.938 |
| 1655.0 | 20.953 |
| 1656.0 | 20.938 |
| 1657.0 | 20.947 |
| 1658.0 | 20.962 |
| 1659.0 | 20.954 |
| 1660.0 | 20.944 |
| 1661.0 | 20.967 |
| 1662.0 | 20.962 |
| 1663.0 | 20.954 |
| 1664.0 | 20.962 |
| 1665.0 | 20.965 |
| 1666.0 | 20.976 |
| 1667.0 | 20.971 |
| 1668.0 | 20.971 |
| 1669.0 | 20.983 |
| 1670.0 | 20.978 |
| 1671.0 | 20.969 |
| 1672.0 | 20.982 |
| 1673.0 | 20.982 |
| 1674.0 | 20.985 |
| 1675.0 | 20.982 |
| 1676.0 | 20.99 |
| 1677.0 | 20.985 |
| 1678.0 | 20.991 |
| 1679.0 | 20.994 |
| 1680.0 | 20.987 |
| 1681.0 | 20.997 |
| 1682.0 | 21 |
| 1683.0 | 20.994 |
| 1684.0 | 21.002 |
| 1685.0 | 21.008 |
| 1686.0 | 20.996 |
| 1687.0 | 21.003 |
| 1688.0 | 21.013 |
| 1689.0 | 21.002 |
| 1690.0 | 21.012 |
| 1691.0 | 21.014 |
| 1692.0 | 21.03 |
| 1693.0 | 21.004 |
| 1694.0 | 21.019 |
| 1695.0 | 21.02 |
| 1696.0 | 21.026 |
| 1697.0 | 21.026 |
| 1698.0 | 21.025 |
| 1699.0 | 21.027 |
| 1700.0 | 21.032 |
| 1701.0 | 21.034 |
| 1702.0 | 21.03 |
| 1703.0 | 21.037 |
| 1704.0 | 21.044 |
| 1705.0 | 21.039 |
| 1706.0 | 21.043 |
| 1707.0 | 21.049 |
| 1708.0 | 21.044 |
| 1709.0 | 21.052 |
| 1710.0 | 21.055 |
| 1711.0 | 21.06 |
| 1712.0 | 21.058 |
| 1713.0 | 21.059 |
| 1714.0 | 21.073 |
| 1715.0 | 21.065 |
| 1716.0 | 21.064 |
| 1717.0 | 21.083 |
| 1718.0 | 21.075 |
| 1719.0 | 21.079 |
| 1720.0 | 21.068 |
| 1721.0 | 21.1 |
| 1722.0 | 21.088 |
| 1723.0 | 21.092 |
| 1724.0 | 21.096 |
| 1725.0 | 21.098 |
| 1726.0 | 21.097 |
| 1727.0 | 21.104 |
| 1728.0 | 21.111 |
| 1729.0 | 21.113 |
| 1730.0 | 21.114 |
| 1731.0 | 21.12 |
| 1732.0 | 21.13 |
| 1733.0 | 21.126 |
| 1734.0 | 21.126 |
| 1735.0 | 21.142 |
| 1736.0 | 21.138 |
| 1737.0 | 21.137 |
| 1738.0 | 21.153 |
| 1739.0 | 21.152 |
| 1740.0 | 21.15 |
| 1741.0 | 21.168 |
| 1742.0 | 21.168 |
| 1743.0 | 21.169 |
| 1744.0 | 21.174 |
| 1745.0 | 21.178 |
| 1746.0 | 21.187 |
| 1747.0 | 21.19 |
| 1748.0 | 21.198 |
| 1749.0 | 21.201 |
| 1750.0 | 21.204 |
| 1751.0 | 21.214 |
| 1752.0 | 21.217 |
| 1753.0 | 21.224 |
| 1754.0 | 21.226 |
| 1755.0 | 21.234 |
| 1756.0 | 21.24 |
| 1757.0 | 21.248 |
| 1758.0 | 21.255 |
| 1759.0 | 21.256 |
| 1760.0 | 21.258 |
| 1761.0 | 21.279 |
| 1762.0 | 21.277 |
| 1763.0 | 21.283 |
| 1764.0 | 21.289 |
| 1765.0 | 21.298 |
| 1766.0 | 21.303 |
| 1767.0 | 21.31 |
| 1768.0 | 21.315 |
| 1769.0 | 21.325 |
| 1770.0 | 21.339 |
| 1771.0 | 21.336 |
| 1772.0 | 21.344 |
| 1773.0 | 21.353 |
| 1774.0 | 21.366 |
| 1775.0 | 21.37 |
| 1776.0 | 21.375 |
| 1777.0 | 21.384 |
| 1778.0 | 21.394 |
| 1779.0 | 21.402 |
| 1780.0 | 21.407 |
| 1781.0 | 21.42 |
| 1782.0 | 21.426 |
| 1783.0 | 21.436 |
| 1784.0 | 21.445 |
| 1785.0 | 21.451 |
| 1786.0 | 21.459 |
| 1787.0 | 21.469 |
| 1788.0 | 21.479 |
| 1789.0 | 21.49 |
| 1790.0 | 21.502 |
| 1791.0 | 21.502 |
| 1792.0 | 21.519 |
| 1793.0 | 21.531 |
| 1794.0 | 21.53 |
| 1795.0 | 21.546 |
| 1796.0 | 21.557 |
| 1797.0 | 21.562 |
| 1798.0 | 21.579 |
| 1799.0 | 21.586 |
| 1800.0 | 21.599 |
| 1801.0 | 21.602 |
| 1802.0 | 21.618 |
| 1803.0 | 21.628 |
| 1804.0 | 21.638 |
| 1805.0 | 21.652 |
| 1806.0 | 21.656 |
| 1807.0 | 21.675 |
| 1808.0 | 21.675 |
| 1809.0 | 21.699 |
| 1810.0 | 21.702 |
| 1811.0 | 21.713 |
| 1812.0 | 21.72 |
| 1813.0 | 21.731 |
| 1814.0 | 21.744 |
| 1815.0 | 21.751 |
| 1816.0 | 21.767 |
| 1817.0 | 21.777 |
| 1818.0 | 21.791 |
| 1819.0 | 21.803 |
| 1820.0 | 21.813 |
| 1821.0 | 21.835 |
| 1822.0 | 21.842 |
| 1823.0 | 21.859 |
| 1824.0 | 21.873 |
| 1825.0 | 21.883 |
| 1826.0 | 21.897 |
| 1827.0 | 21.914 |
| 1828.0 | 21.926 |
| 1829.0 | 21.938 |
| 1830.0 | 21.949 |
| 1831.0 | 21.96 |
| 1832.0 | 21.973 |
| 1833.0 | 21.981 |
| 1834.0 | 21.996 |
| 1835.0 | 22.011 |
| 1836.0 | 22.021 |
| 1837.0 | 22.036 |
| 1838.0 | 22.048 |
| 1839.0 | 22.063 |
| 1840.0 | 22.076 |
| 1841.0 | 22.093 |
| 1842.0 | 22.11 |
| 1843.0 | 22.123 |
| 1844.0 | 22.137 |
| 1845.0 | 22.15 |
| 1846.0 | 22.167 |
| 1847.0 | 22.183 |
| 1848.0 | 22.194 |
| 1849.0 | 22.212 |
| 1850.0 | 22.228 |
| 1851.0 | 22.241 |
| 1852.0 | 22.261 |
| 1853.0 | 22.278 |
| 1854.0 | 22.294 |
| 1855.0 | 22.308 |
| 1856.0 | 22.329 |
| 1857.0 | 22.344 |
| 1858.0 | 22.351 |
| 1859.0 | 22.373 |
| 1860.0 | 22.39 |
| 1861.0 | 22.406 |
| 1862.0 | 22.42 |
| 1863.0 | 22.439 |
| 1864.0 | 22.451 |
| 1865.0 | 22.472 |
| 1866.0 | 22.486 |
| 1867.0 | 22.505 |
| 1868.0 | 22.52 |
| 1869.0 | 22.535 |
| 1870.0 | 22.558 |
| 1871.0 | 22.575 |
| 1872.0 | 22.597 |
| 1873.0 | 22.613 |
| 1874.0 | 22.64 |
| 1875.0 | 22.659 |
| 1876.0 | 22.672 |
| 1877.0 | 22.69 |
| 1878.0 | 22.712 |
| 1879.0 | 22.722 |
| 1880.0 | 22.739 |
| 1881.0 | 22.76 |
| 1882.0 | 22.772 |
| 1883.0 | 22.788 |
| 1884.0 | 22.804 |
| 1885.0 | 22.821 |
| 1886.0 | 22.841 |
| 1887.0 | 22.852 |
| 1888.0 | 22.873 |
| 1889.0 | 22.896 |
| 1890.0 | 22.909 |
| 1891.0 | 22.928 |
| 1892.0 | 22.946 |
| 1893.0 | 22.972 |
| 1894.0 | 22.984 |
| 1895.0 | 22.997 |
| 1896.0 | 23.017 |
| 1897.0 | 23.036 |
| 1898.0 | 23.057 |
| 1899.0 | 23.083 |
| 1900.0 | 23.098 |
| 1901.0 | 23.128 |
| 1902.0 | 23.134 |
| 1903.0 | 23.157 |
| 1904.0 | 23.174 |
| 1905.0 | 23.196 |
| 1906.0 | 23.215 |
| 1907.0 | 23.236 |
| 1908.0 | 23.248 |
| 1909.0 | 23.269 |
| 1910.0 | 23.29 |
| 1911.0 | 23.303 |
| 1912.0 | 23.323 |
| 1913.0 | 23.341 |
| 1914.0 | 23.363 |
| 1915.0 | 23.382 |
| 1916.0 | 23.403 |
| 1917.0 | 23.424 |
| 1918.0 | 23.446 |
| 1919.0 | 23.464 |
| 1920.0 | 23.49 |
| 1921.0 | 23.5 |
| 1922.0 | 23.527 |
| 1923.0 | 23.55 |
| 1924.0 | 23.57 |
| 1925.0 | 23.59 |
| 1926.0 | 23.606 |
| 1927.0 | 23.629 |
| 1928.0 | 23.65 |
| 1929.0 | 23.664 |
| 1930.0 | 23.686 |
| 1931.0 | 23.712 |
| 1932.0 | 23.725 |
| 1933.0 | 23.745 |
| 1934.0 | 23.762 |
| 1935.0 | 23.769 |
| 1936.0 | 23.815 |
| 1937.0 | 23.826 |
| 1938.0 | 23.85 |
| 1939.0 | 23.873 |
| 1940.0 | 23.894 |
| 1941.0 | 23.916 |
| 1942.0 | 23.937 |
| 1943.0 | 23.958 |
| 1944.0 | 23.983 |
| 1945.0 | 24.002 |
| 1946.0 | 24.022 |
| 1947.0 | 24.041 |
| 1948.0 | 24.06 |
| 1949.0 | 24.084 |
| 1950.0 | 24.107 |
| 1951.0 | 24.116 |
| 1952.0 | 24.147 |
| 1953.0 | 24.163 |
| 1954.0 | 24.182 |
| 1955.0 | 24.205 |
| 1956.0 | 24.227 |
| 1957.0 | 24.245 |
| 1958.0 | 24.263 |
| 1959.0 | 24.287 |
| 1960.0 | 24.302 |
| 1961.0 | 24.338 |
| 1962.0 | 24.346 |
| 1963.0 | 24.363 |
| 1964.0 | 24.39 |
| 1965.0 | 24.408 |
| 1966.0 | 24.445 |
| 1967.0 | 24.455 |
| 1968.0 | 24.473 |
| 1969.0 | 24.498 |
| 1970.0 | 24.523 |
| 1971.0 | 24.534 |
| 1972.0 | 24.56 |
| 1973.0 | 24.576 |
| 1974.0 | 24.605 |
| 1975.0 | 24.618 |
| 1976.0 | 24.643 |
| 1977.0 | 24.665 |
| 1978.0 | 24.679 |
| 1979.0 | 24.71 |
| 1980.0 | 24.725 |
| 1981.0 | 24.742 |
| 1982.0 | 24.781 |
| 1983.0 | 24.782 |
| 1984.0 | 24.807 |
| 1985.0 | 24.847 |
| 1986.0 | 24.84 |
| 1987.0 | 24.871 |
| 1988.0 | 24.911 |
| 1989.0 | 24.918 |
| 1990.0 | 24.926 |
| 1991.0 | 24.972 |
| 1992.0 | 24.98 |
| 1993.0 | 24.995 |
| 1994.0 | 25.03 |
| 1995.0 | 25.048 |
| 1996.0 | 25.069 |
| 1997.0 | 25.086 |
| 1998.0 | 25.111 |
| 1999.0 | 25.128 |
| 2000.0 | 25.168 |
| 2001.0 | 25.165 |
| 2002.0 | 25.2 |
| 2003.0 | 25.228 |
| 2004.0 | 25.237 |
| 2005.0 | 25.271 |
| 2006.0 | 25.287 |
| 2007.0 | 25.314 |
| 2008.0 | 25.336 |
| 2009.0 | 25.357 |
| 2010.0 | 25.377 |
| 2011.0 | 25.408 |
| 2012.0 | 25.424 |
| 2013.0 | 25.444 |
| 2014.0 | 25.474 |
| 2015.0 | 25.493 |
| 2016.0 | 25.515 |
| 2017.0 | 25.546 |
| 2018.0 | 25.565 |
| 2019.0 | 25.589 |
| 2020.0 | 25.599 |
| 2021.0 | 25.651 |
| 2022.0 | 25.656 |
| 2023.0 | 25.671 |
| 2024.0 | 25.718 |
| 2025.0 | 25.733 |
| 2026.0 | 25.764 |
| 2027.0 | 25.762 |
| 2028.0 | 25.803 |
| 2029.0 | 25.83 |
| 2030.0 | 25.852 |
| 2031.0 | 25.873 |
| 2032.0 | 25.897 |
| 2033.0 | 25.928 |
| 2034.0 | 25.945 |
| 2035.0 | 25.97 |
| 2036.0 | 25.993 |
| 2037.0 | 26.022 |
| 2038.0 | 26.042 |
| 2039.0 | 26.065 |
| 2040.0 | 26.101 |
| 2041.0 | 26.116 |
| 2042.0 | 26.138 |
| 2043.0 | 26.175 |
| 2044.0 | 26.187 |
| 2045.0 | 26.217 |
| 2046.0 | 26.246 |
| 2047.0 | 26.26 |
| 2048.0 | 26.286 |
| 2049.0 | 26.321 |
| 2050.0 | 26.335 |
| 2051.0 | 26.363 |
| 2052.0 | 26.395 |
| 2053.0 | 26.409 |
| 2054.0 | 26.43 |
| 2055.0 | 26.463 |
| 2056.0 | 26.48 |
| 2057.0 | 26.507 |
| 2058.0 | 26.535 |
| 2059.0 | 26.55 |
| 2060.0 | 26.579 |
| 2061.0 | 26.606 |
| 2062.0 | 26.624 |
| 2063.0 | 26.647 |
| 2064.0 | 26.686 |
| 2065.0 | 26.693 |
| 2066.0 | 26.721 |
| 2067.0 | 26.758 |
| 2068.0 | 26.76 |
| 2069.0 | 26.792 |
| 2070.0 | 26.821 |
| 2071.0 | 26.832 |
| 2072.0 | 26.865 |
| 2073.0 | 26.884 |
| 2074.0 | 26.909 |
| 2075.0 | 26.944 |
| 2076.0 | 26.934 |
| 2077.0 | 26.976 |
| 2078.0 | 26.999 |
| 2079.0 | 27.027 |
| 2080.0 | 27.045 |
| 2081.0 | 27.067 |
| 2082.0 | 27.089 |
| 2083.0 | 27.117 |
| 2084.0 | 27.131 |
| 2085.0 | 27.156 |
| 2086.0 | 27.185 |
| 2087.0 | 27.199 |
| 2088.0 | 27.224 |
| 2089.0 | 27.248 |
| 2090.0 | 27.265 |
| 2091.0 | 27.29 |
| 2092.0 | 27.317 |
| 2093.0 | 27.323 |
| 2094.0 | 27.353 |
| 2095.0 | 27.391 |
| 2096.0 | 27.384 |
| 2097.0 | 27.417 |
| 2098.0 | 27.435 |
| 2099.0 | 27.463 |
| 2100.0 | 27.476 |
| 2101.0 | 27.5 |
| 2102.0 | 27.522 |
| 2103.0 | 27.542 |
| 2104.0 | 27.56 |
| 2105.0 | 27.576 |
| 2106.0 | 27.602 |
| 2107.0 | 27.617 |
| 2108.0 | 27.643 |
| 2109.0 | 27.655 |
| 2110.0 | 27.67 |
| 2111.0 | 27.701 |
| 2112.0 | 27.71 |
| 2113.0 | 27.728 |
| 2114.0 | 27.762 |
| 2115.0 | 27.754 |
| 2116.0 | 27.784 |
| 2117.0 | 27.816 |
| 2118.0 | 27.807 |
| 2119.0 | 27.839 |
| 2120.0 | 27.856 |
| 2121.0 | 27.886 |
| 2122.0 | 27.868 |
| 2123.0 | 27.905 |
| 2124.0 | 27.92 |
| 2125.0 | 27.924 |
| 2126.0 | 27.966 |
| 2127.0 | 27.971 |
| 2128.0 | 27.986 |
| 2129.0 | 27.992 |
| 2130.0 | 28.018 |
| 2131.0 | 28.031 |
| 2132.0 | 28.04 |
| 2133.0 | 28.06 |
| 2134.0 | 28.07 |
| 2135.0 | 28.086 |
| 2136.0 | 28.098 |
| 2137.0 | 28.117 |
| 2138.0 | 28.125 |
| 2139.0 | 28.139 |
| 2140.0 | 28.149 |
| 2141.0 | 28.174 |
| 2142.0 | 28.178 |
| 2143.0 | 28.186 |
| 2144.0 | 28.222 |
| 2145.0 | 28.219 |
| 2146.0 | 28.227 |
| 2147.0 | 28.256 |
| 2148.0 | 28.267 |
| 2149.0 | 28.281 |
| 2150.0 | 28.285 |
| 2151.0 | 28.309 |
| 2152.0 | 28.332 |
| 2153.0 | 28.328 |
| 2154.0 | 28.353 |
| 2155.0 | 28.37 |
| 2156.0 | 28.383 |
| 2157.0 | 28.411 |
| 2158.0 | 28.422 |
| 2159.0 | 28.436 |
| 2160.0 | 28.456 |
| 2161.0 | 28.47 |
| 2162.0 | 28.493 |
| 2163.0 | 28.506 |
| 2164.0 | 28.529 |
| 2165.0 | 28.55 |
| 2166.0 | 28.564 |
| 2167.0 | 28.586 |
| 2168.0 | 28.607 |
| 2169.0 | 28.625 |
| 2170.0 | 28.644 |
| 2171.0 | 28.668 |
| 2172.0 | 28.686 |
| 2173.0 | 28.702 |
| 2174.0 | 28.719 |
| 2175.0 | 28.73 |
| 2176.0 | 28.762 |
| 2177.0 | 28.787 |
| 2178.0 | 28.775 |
| 2179.0 | 28.828 |
| 2180.0 | 28.819 |
| 2181.0 | 28.857 |
| 2182.0 | 28.852 |
| 2183.0 | 28.894 |
| 2184.0 | 28.899 |
| 2185.0 | 28.919 |
| 2186.0 | 28.936 |
| 2187.0 | 28.946 |
| 2188.0 | 28.949 |
| 2189.0 | 28.98 |
| 2190.0 | 28.996 |
| 2191.0 | 29.009 |
| 2192.0 | 29.025 |
| 2193.0 | 29.046 |
| 2194.0 | 29.061 |
| 2195.0 | 29.073 |
| 2196.0 | 29.093 |
| 2197.0 | 29.103 |
| 2198.0 | 29.125 |
| 2199.0 | 29.132 |
| 2200.0 | 29.158 |
| 2201.0 | 29.165 |
| 2202.0 | 29.19 |
| 2203.0 | 29.204 |
| 2204.0 | 29.216 |
| 2205.0 | 29.231 |
| 2206.0 | 29.248 |
| 2207.0 | 29.263 |
| 2208.0 | 29.279 |
| 2209.0 | 29.296 |
| 2210.0 | 29.316 |
| 2211.0 | 29.331 |
| 2212.0 | 29.352 |
| 2213.0 | 29.364 |
| 2214.0 | 29.394 |
| 2215.0 | 29.41 |
| 2216.0 | 29.426 |
| 2217.0 | 29.448 |
| 2218.0 | 29.47 |
| 2219.0 | 29.49 |
| 2220.0 | 29.512 |
| 2221.0 | 29.536 |
| 2222.0 | 29.56 |
| 2223.0 | 29.582 |
| 2224.0 | 29.604 |
| 2225.0 | 29.633 |
| 2226.0 | 29.655 |
| 2227.0 | 29.674 |
| 2228.0 | 29.701 |
| 2229.0 | 29.726 |
| 2230.0 | 29.754 |
| 2231.0 | 29.779 |
| 2232.0 | 29.804 |
| 2233.0 | 29.833 |
| 2234.0 | 29.855 |
| 2235.0 | 29.882 |
| 2236.0 | 29.91 |
| 2237.0 | 29.936 |
| 2238.0 | 29.964 |
| 2239.0 | 29.989 |
| 2240.0 | 30.018 |
| 2241.0 | 30.043 |
| 2242.0 | 30.071 |
| 2243.0 | 30.099 |
| 2244.0 | 30.124 |
| 2245.0 | 30.153 |
| 2246.0 | 30.176 |
| 2247.0 | 30.207 |
| 2248.0 | 30.231 |
| 2249.0 | 30.26 |
| 2250.0 | 30.288 |
| 2251.0 | 30.313 |
| 2252.0 | 30.339 |
| 2253.0 | 30.37 |
| 2254.0 | 30.397 |
| 2255.0 | 30.423 |
| 2256.0 | 30.457 |
| 2257.0 | 30.485 |
| 2258.0 | 30.514 |
| 2259.0 | 30.541 |
| 2260.0 | 30.565 |
| 2261.0 | 30.594 |
| 2262.0 | 30.619 |
| 2263.0 | 30.648 |
| 2264.0 | 30.679 |
| 2265.0 | 30.707 |
| 2266.0 | 30.741 |
| 2267.0 | 30.766 |
| 2268.0 | 30.795 |
| 2269.0 | 30.824 |
| 2270.0 | 30.844 |
| 2271.0 | 30.892 |
| 2272.0 | 30.915 |
| 2273.0 | 30.941 |
| 2274.0 | 30.971 |
| 2275.0 | 30.995 |
| 2276.0 | 31.03 |
| 2277.0 | 31.06 |
| 2278.0 | 31.084 |
| 2279.0 | 31.115 |
| 2280.0 | 31.146 |
| 2281.0 | 31.166 |
| 2282.0 | 31.195 |
| 2283.0 | 31.221 |
| 2284.0 | 31.248 |
| 2285.0 | 31.268 |
| 2286.0 | 31.301 |
| 2287.0 | 31.328 |
| 2288.0 | 31.351 |
| 2289.0 | 31.374 |
| 2290.0 | 31.402 |
| 2291.0 | 31.432 |
| 2292.0 | 31.454 |
| 2293.0 | 31.477 |
| 2294.0 | 31.51 |
| 2295.0 | 31.527 |
| 2296.0 | 31.553 |
| 2297.0 | 31.584 |
| 2298.0 | 31.609 |
| 2299.0 | 31.627 |
| 2300.0 | 31.658 |
| 2301.0 | 31.683 |
| 2302.0 | 31.704 |
| 2303.0 | 31.728 |
| 2304.0 | 31.755 |
| 2305.0 | 31.78 |
| 2306.0 | 31.805 |
| 2307.0 | 31.823 |
| 2308.0 | 31.852 |
| 2309.0 | 31.871 |
| 2310.0 | 31.898 |
| 2311.0 | 31.923 |
| 2312.0 | 31.95 |
| 2313.0 | 31.969 |
| 2314.0 | 31.987 |
| 2315.0 | 32.018 |
| 2316.0 | 32.038 |
| 2317.0 | 32.062 |
| 2318.0 | 32.078 |
| 2319.0 | 32.107 |
| 2320.0 | 32.129 |
| 2321.0 | 32.146 |
| 2322.0 | 32.161 |
| 2323.0 | 32.185 |
| 2324.0 | 32.204 |
| 2325.0 | 32.222 |
| 2326.0 | 32.272 |
| 2327.0 | 32.268 |
| 2328.0 | 32.306 |
| 2329.0 | 32.31 |
| 2330.0 | 32.361 |
| 2331.0 | 32.335 |
| 2332.0 | 32.377 |
| 2333.0 | 32.409 |
| 2334.0 | 32.416 |
| 2335.0 | 32.43 |
| 2336.0 | 32.477 |
| 2337.0 | 32.473 |
| 2338.0 | 32.492 |
| 2339.0 | 32.508 |
| 2340.0 | 32.529 |
| 2341.0 | 32.545 |
| 2342.0 | 32.559 |
| 2343.0 | 32.577 |
| 2344.0 | 32.592 |
| 2345.0 | 32.607 |
| 2346.0 | 32.621 |
| 2347.0 | 32.641 |
| 2348.0 | 32.652 |
| 2349.0 | 32.669 |
| 2350.0 | 32.684 |
| 2351.0 | 32.7 |
| 2352.0 | 32.711 |
| 2353.0 | 32.722 |
| 2354.0 | 32.738 |
| 2355.0 | 32.75 |
| 2356.0 | 32.759 |
| 2357.0 | 32.774 |
| 2358.0 | 32.781 |
| 2359.0 | 32.794 |
| 2360.0 | 32.803 |
| 2361.0 | 32.807 |
| 2362.0 | 32.819 |
| 2363.0 | 32.83 |
| 2364.0 | 32.832 |
| 2365.0 | 32.848 |
| 2366.0 | 32.853 |
| 2367.0 | 32.857 |
| 2368.0 | 32.868 |
| 2369.0 | 32.867 |
| 2370.0 | 32.88 |
| 2371.0 | 32.883 |
| 2372.0 | 32.891 |
| 2373.0 | 32.891 |
| 2374.0 | 32.901 |
| 2375.0 | 32.899 |
| 2376.0 | 32.909 |
| 2377.0 | 32.916 |
| 2378.0 | 32.919 |
| 2379.0 | 32.92 |
| 2380.0 | 32.932 |
| 2381.0 | 32.929 |
| 2382.0 | 32.936 |
| 2383.0 | 32.942 |
| 2384.0 | 32.95 |
| 2385.0 | 32.947 |
| 2386.0 | 32.958 |
| 2387.0 | 32.96 |
| 2388.0 | 32.971 |
| 2389.0 | 32.979 |
| 2390.0 | 32.986 |
| 2391.0 | 32.992 |
| 2392.0 | 33 |
| 2393.0 | 33.017 |
| 2394.0 | 33.023 |
| 2395.0 | 33.031 |
| 2396.0 | 33.04 |
| 2397.0 | 33.053 |
| 2398.0 | 33.063 |
| 2399.0 | 33.072 |
| 2400.0 | 33.086 |
| 2401.0 | 33.09 |
| 2402.0 | 33.112 |
| 2403.0 | 33.124 |
| 2404.0 | 33.145 |
| 2405.0 | 33.153 |
| 2406.0 | 33.169 |
| 2407.0 | 33.187 |
| 2408.0 | 33.201 |
| 2409.0 | 33.223 |
| 2410.0 | 33.234 |
| 2411.0 | 33.247 |
| 2412.0 | 33.267 |
| 2413.0 | 33.281 |
| 2414.0 | 33.299 |
| 2415.0 | 33.31 |
| 2416.0 | 33.335 |
| 2417.0 | 33.355 |
| 2418.0 | 33.371 |
| 2419.0 | 33.391 |
| 2420.0 | 33.406 |
| 2421.0 | 33.425 |
| 2422.0 | 33.447 |
| 2423.0 | 33.465 |
| 2424.0 | 33.478 |
| 2425.0 | 33.515 |
| 2426.0 | 33.517 |
| 2427.0 | 33.54 |
| 2428.0 | 33.55 |
| 2429.0 | 33.573 |
| 2430.0 | 33.594 |
| 2431.0 | 33.607 |
| 2432.0 | 33.63 |
| 2433.0 | 33.644 |
| 2434.0 | 33.665 |
| 2435.0 | 33.666 |
| 2436.0 | 33.685 |
| 2437.0 | 33.696 |
| 2438.0 | 33.717 |
| 2439.0 | 33.729 |
| 2440.0 | 33.74 |
| 2441.0 | 33.761 |
| 2442.0 | 33.771 |
| 2443.0 | 33.779 |
| 2444.0 | 33.789 |
| 2445.0 | 33.802 |
| 2446.0 | 33.824 |
| 2447.0 | 33.835 |
| 2448.0 | 33.851 |
| 2449.0 | 33.861 |
| 2450.0 | 33.876 |
| 2451.0 | 33.888 |
| 2452.0 | 33.901 |
| 2453.0 | 33.907 |
| 2454.0 | 33.922 |
| 2455.0 | 33.935 |
| 2456.0 | 33.948 |
| 2457.0 | 33.96 |
| 2458.0 | 33.973 |
| 2459.0 | 33.99 |
| 2460.0 | 33.998 |
| 2461.0 | 34.008 |
| 2462.0 | 34.029 |
| 2463.0 | 34.019 |
| 2464.0 | 34.059 |
| 2465.0 | 34.064 |
| 2466.0 | 34.077 |
| 2467.0 | 34.077 |
| 2468.0 | 34.091 |
| 2469.0 | 34.104 |
| 2470.0 | 34.116 |
| 2471.0 | 34.126 |
| 2472.0 | 34.138 |
| 2473.0 | 34.144 |
| 2474.0 | 34.149 |
| 2475.0 | 34.168 |
| 2476.0 | 34.178 |
| 2477.0 | 34.196 |
| 2478.0 | 34.207 |
| 2479.0 | 34.216 |
| 2480.0 | 34.23 |
| 2481.0 | 34.243 |
| 2482.0 | 34.251 |
| 2483.0 | 34.258 |
| 2484.0 | 34.268 |
| 2485.0 | 34.289 |
| 2486.0 | 34.292 |
| 2487.0 | 34.306 |
| 2488.0 | 34.318 |
| 2489.0 | 34.327 |
| 2490.0 | 34.343 |
| 2491.0 | 34.353 |
| 2492.0 | 34.366 |
| 2493.0 | 34.373 |
| 2494.0 | 34.391 |
| 2495.0 | 34.399 |
| 2496.0 | 34.413 |
| 2497.0 | 34.429 |
| 2498.0 | 34.437 |
| 2499.0 | 34.447 |
| 2500.0 | 34.459 |
| 2501.0 | 34.471 |
| 2502.0 | 34.483 |
| 2503.0 | 34.493 |
| 2504.0 | 34.509 |
| 2505.0 | 34.524 |
| 2506.0 | 34.531 |
| 2507.0 | 34.542 |
| 2508.0 | 34.552 |
| 2509.0 | 34.569 |
| 2510.0 | 34.575 |
| 2511.0 | 34.587 |
| 2512.0 | 34.598 |
| 2513.0 | 34.606 |
| 2514.0 | 34.616 |
| 2515.0 | 34.629 |
| 2516.0 | 34.633 |
| 2517.0 | 34.643 |
| 2518.0 | 34.659 |
| 2519.0 | 34.668 |
| 2520.0 | 34.679 |
| 2521.0 | 34.688 |
| 2522.0 | 34.697 |
| 2523.0 | 34.705 |
| 2524.0 | 34.719 |
| 2525.0 | 34.722 |
| 2526.0 | 34.738 |
| 2527.0 | 34.746 |
| 2528.0 | 34.756 |
| 2529.0 | 34.772 |
| 2530.0 | 34.781 |
| 2531.0 | 34.786 |
| 2532.0 | 34.796 |
| 2533.0 | 34.809 |
| 2534.0 | 34.82 |
| 2535.0 | 34.832 |
| 2536.0 | 34.842 |
| 2537.0 | 34.857 |
| 2538.0 | 34.874 |
| 2539.0 | 34.883 |
| 2540.0 | 34.899 |
| 2541.0 | 34.913 |
| 2542.0 | 34.924 |
| 2543.0 | 34.938 |
| 2544.0 | 34.954 |
| 2545.0 | 34.967 |
| 2546.0 | 34.976 |
| 2547.0 | 34.993 |
| 2548.0 | 35.01 |
| 2549.0 | 35.023 |
| 2550.0 | 35.041 |
| 2551.0 | 35.056 |
| 2552.0 | 35.067 |
| 2553.0 | 35.09 |
| 2554.0 | 35.106 |
| 2555.0 | 35.125 |
| 2556.0 | 35.141 |
| 2557.0 | 35.155 |
| 2558.0 | 35.175 |
| 2559.0 | 35.187 |
| 2560.0 | 35.207 |
| 2561.0 | 35.222 |
| 2562.0 | 35.246 |
| 2563.0 | 35.263 |
| 2564.0 | 35.284 |
| 2565.0 | 35.302 |
| 2566.0 | 35.319 |
| 2567.0 | 35.335 |
| 2568.0 | 35.35 |
| 2569.0 | 35.368 |
| 2570.0 | 35.377 |
| 2571.0 | 35.4 |
| 2572.0 | 35.411 |
| 2573.0 | 35.422 |
| 2574.0 | 35.433 |
| 2575.0 | 35.453 |
| 2576.0 | 35.465 |
| 2577.0 | 35.476 |
| 2578.0 | 35.493 |
| 2579.0 | 35.499 |
| 2580.0 | 35.509 |
| 2581.0 | 35.522 |
| 2582.0 | 35.53 |
| 2583.0 | 35.547 |
| 2584.0 | 35.559 |
| 2585.0 | 35.567 |
| 2586.0 | 35.579 |
| 2587.0 | 35.599 |
| 2588.0 | 35.597 |
| 2589.0 | 35.615 |
| 2590.0 | 35.626 |
| 2591.0 | 35.633 |
| 2592.0 | 35.653 |
| 2593.0 | 35.67 |
| 2594.0 | 35.682 |
| 2595.0 | 35.691 |
| 2596.0 | 35.711 |
| 2597.0 | 35.738 |
| 2598.0 | 35.743 |
| 2599.0 | 35.774 |
| 2600.0 | 35.778 |